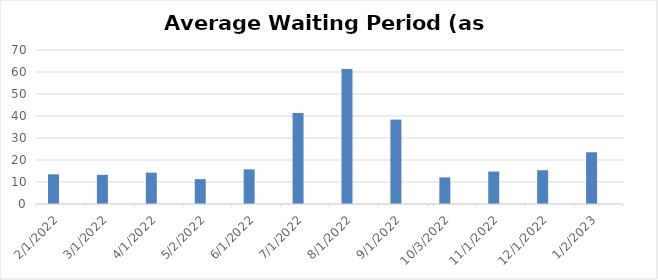
| Category | Current | Series 1 |
|---|---|---|
| 2/1/22 | 13.48 |  |
| 3/1/22 | 13.26 |  |
| 4/1/22 | 14.25 |  |
| 5/2/22 | 11.3 |  |
| 6/1/22 | 15.75 |  |
| 7/1/22 | 41.37 |  |
| 8/1/22 | 61.38 |  |
| 9/1/22 | 38.37 |  |
| 10/3/22 | 12.1 |  |
| 11/1/22 | 14.75 |  |
| 12/1/22 | 15.36 |  |
| 1/2/23 | 23.51 |  |